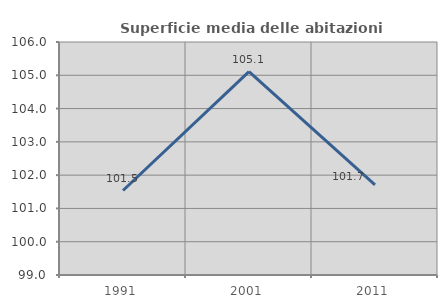
| Category | Superficie media delle abitazioni occupate |
|---|---|
| 1991.0 | 101.538 |
| 2001.0 | 105.109 |
| 2011.0 | 101.706 |